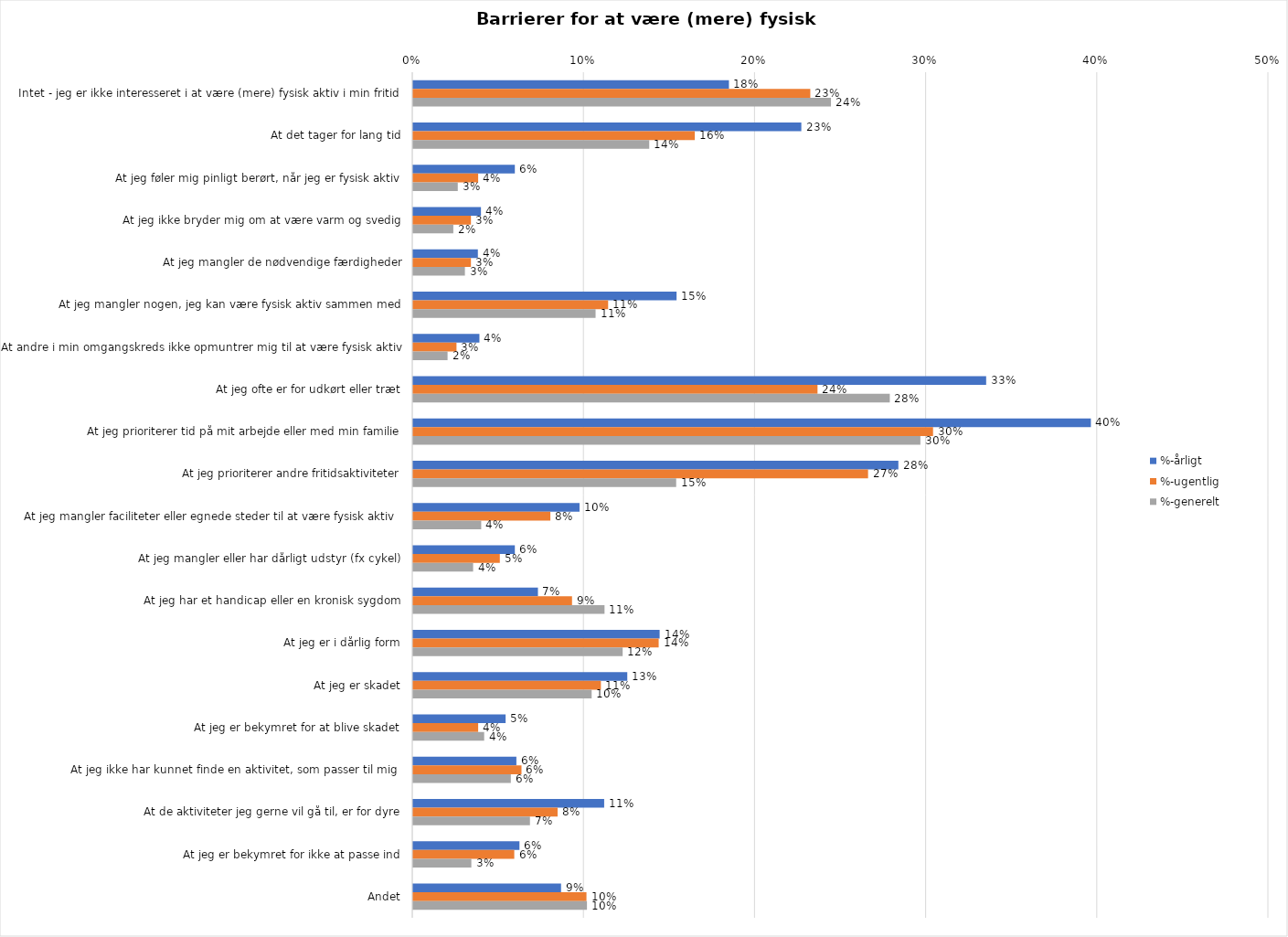
| Category | %-årligt | %-ugentlig | %-generelt |
|---|---|---|---|
| Intet - jeg er ikke interesseret i at være (mere) fysisk aktiv i min fritid | 0.185 | 0.232 | 0.244 |
| At det tager for lang tid | 0.227 | 0.165 | 0.138 |
| At jeg føler mig pinligt berørt, når jeg er fysisk aktiv | 0.059 | 0.038 | 0.026 |
| At jeg ikke bryder mig om at være varm og svedig | 0.04 | 0.034 | 0.023 |
| At jeg mangler de nødvendige færdigheder | 0.038 | 0.034 | 0.03 |
| At jeg mangler nogen, jeg kan være fysisk aktiv sammen med | 0.154 | 0.114 | 0.107 |
| At andre i min omgangskreds ikke opmuntrer mig til at være fysisk aktiv | 0.039 | 0.025 | 0.02 |
| At jeg ofte er for udkørt eller træt | 0.335 | 0.236 | 0.279 |
| At jeg prioriterer tid på mit arbejde eller med min familie | 0.396 | 0.304 | 0.296 |
| At jeg prioriterer andre fritidsaktiviteter | 0.284 | 0.266 | 0.154 |
| At jeg mangler faciliteter eller egnede steder til at være fysisk aktiv  | 0.097 | 0.08 | 0.04 |
| At jeg mangler eller har dårligt udstyr (fx cykel) | 0.059 | 0.051 | 0.035 |
| At jeg har et handicap eller en kronisk sygdom | 0.073 | 0.093 | 0.112 |
| At jeg er i dårlig form | 0.144 | 0.143 | 0.122 |
| At jeg er skadet | 0.125 | 0.11 | 0.104 |
| At jeg er bekymret for at blive skadet | 0.054 | 0.038 | 0.041 |
| At jeg ikke har kunnet finde en aktivitet, som passer til mig  | 0.06 | 0.063 | 0.057 |
| At de aktiviteter jeg gerne vil gå til, er for dyre | 0.112 | 0.084 | 0.068 |
| At jeg er bekymret for ikke at passe ind | 0.062 | 0.059 | 0.034 |
| Andet | 0.086 | 0.101 | 0.102 |